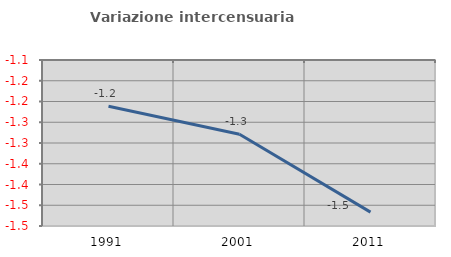
| Category | Variazione intercensuaria annua |
|---|---|
| 1991.0 | -1.211 |
| 2001.0 | -1.279 |
| 2011.0 | -1.467 |